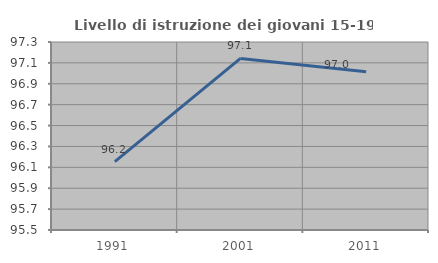
| Category | Livello di istruzione dei giovani 15-19 anni |
|---|---|
| 1991.0 | 96.154 |
| 2001.0 | 97.143 |
| 2011.0 | 97.015 |